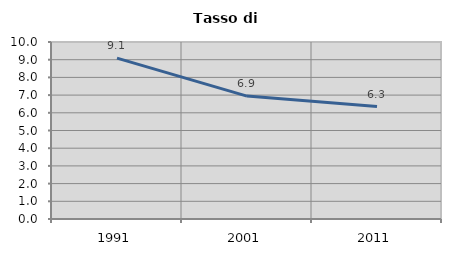
| Category | Tasso di disoccupazione   |
|---|---|
| 1991.0 | 9.091 |
| 2001.0 | 6.944 |
| 2011.0 | 6.349 |